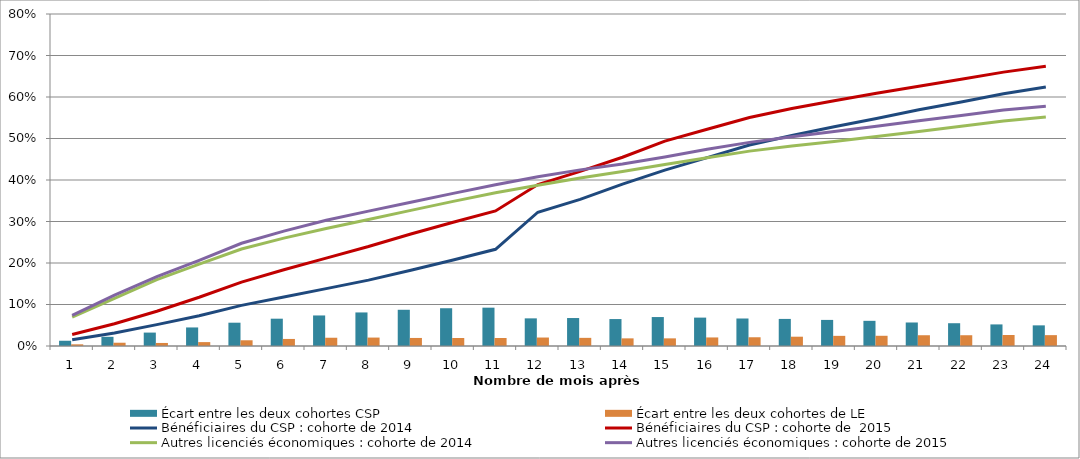
| Category | Écart entre les deux cohortes CSP | Écart entre les deux cohortes de LE |
|---|---|---|
| 1.0 | 0.013 | 0.004 |
| 2.0 | 0.022 | 0.008 |
| 3.0 | 0.032 | 0.007 |
| 4.0 | 0.045 | 0.009 |
| 5.0 | 0.056 | 0.014 |
| 6.0 | 0.066 | 0.017 |
| 7.0 | 0.074 | 0.02 |
| 8.0 | 0.081 | 0.02 |
| 9.0 | 0.087 | 0.019 |
| 10.0 | 0.091 | 0.019 |
| 11.0 | 0.092 | 0.019 |
| 12.0 | 0.067 | 0.02 |
| 13.0 | 0.067 | 0.02 |
| 14.0 | 0.065 | 0.018 |
| 15.0 | 0.07 | 0.018 |
| 16.0 | 0.068 | 0.021 |
| 17.0 | 0.066 | 0.021 |
| 18.0 | 0.065 | 0.022 |
| 19.0 | 0.063 | 0.024 |
| 20.0 | 0.061 | 0.025 |
| 21.0 | 0.057 | 0.026 |
| 22.0 | 0.055 | 0.026 |
| 23.0 | 0.052 | 0.027 |
| 24.0 | 0.05 | 0.026 |